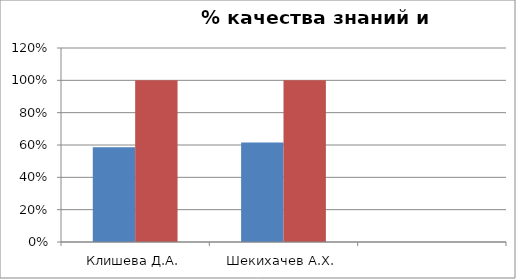
| Category | Series 0 | 2 |
|---|---|---|
| Клишева Д.А. | 0.586 | 1 |
| Шекихачев А.Х. | 0.615 | 1 |